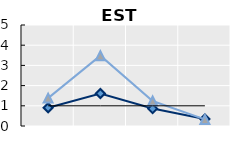
| Category | Public goods | Individual items only | Series 1 |
|---|---|---|---|
| 15-24 | 0.902 | 1.381 | 1 |
| 25-54 | 1.61 | 3.482 | 1 |
| 55-64 | 0.863 | 1.236 | 1 |
| 65+ | 0.347 | 0.326 | 1 |